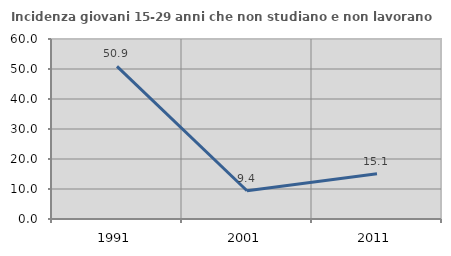
| Category | Incidenza giovani 15-29 anni che non studiano e non lavorano  |
|---|---|
| 1991.0 | 50.865 |
| 2001.0 | 9.424 |
| 2011.0 | 15.111 |